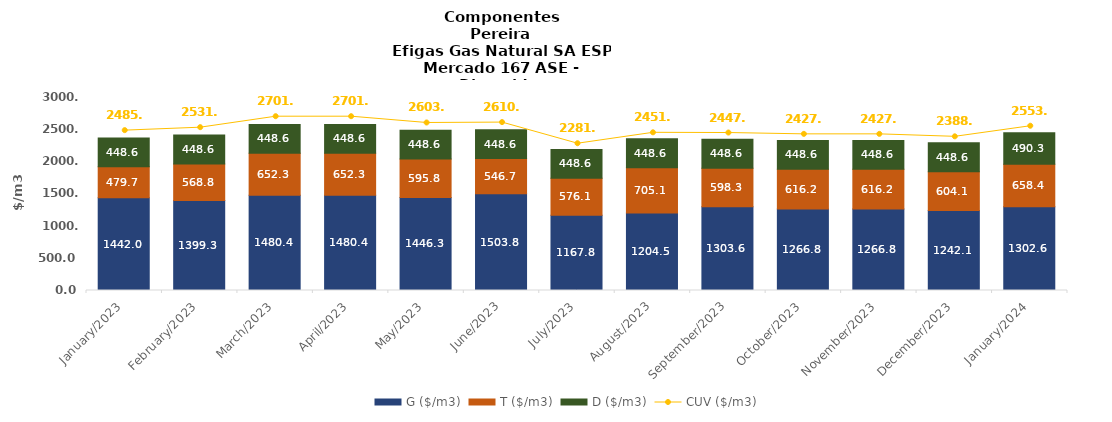
| Category | G ($/m3) | T ($/m3) | D ($/m3) |
|---|---|---|---|
| 2023-01-01 | 1442 | 479.72 | 448.63 |
| 2023-02-01 | 1399.342 | 568.805 | 448.635 |
| 2023-03-01 | 1480.39 | 652.25 | 448.635 |
| 2023-04-01 | 1480.39 | 652.25 | 448.635 |
| 2023-05-01 | 1446.347 | 595.782 | 448.635 |
| 2023-06-01 | 1503.75 | 546.731 | 448.635 |
| 2023-07-01 | 1167.85 | 576.067 | 448.635 |
| 2023-08-01 | 1204.533 | 705.123 | 448.635 |
| 2023-09-01 | 1303.571 | 598.275 | 448.635 |
| 2023-10-01 | 1266.828 | 616.197 | 448.635 |
| 2023-11-01 | 1266.828 | 616.197 | 448.635 |
| 2023-12-01 | 1242.144 | 604.124 | 448.635 |
| 2024-01-01 | 1302.583 | 658.407 | 490.269 |